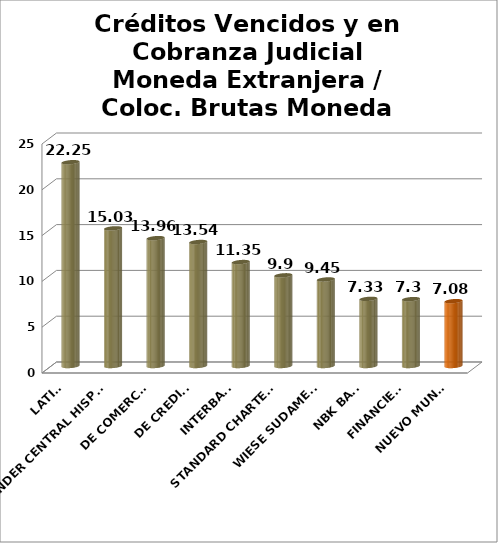
| Category | Series 0 |
|---|---|
| LATINO | 22.25 |
| SANTANDER CENTRAL HISPANO | 15.03 |
| DE COMERCIO | 13.96 |
| DE CREDITO | 13.54 |
| INTERBANK | 11.35 |
| STANDARD CHARTERED | 9.9 |
| WIESE SUDAMERIS | 9.45 |
| NBK BANK  | 7.33 |
| FINANCIERO | 7.3 |
| NUEVO MUNDO | 7.08 |